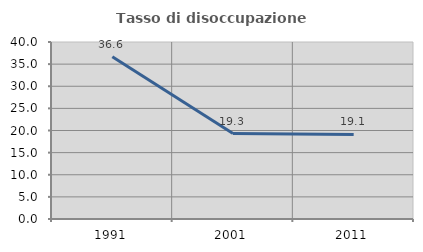
| Category | Tasso di disoccupazione giovanile  |
|---|---|
| 1991.0 | 36.646 |
| 2001.0 | 19.318 |
| 2011.0 | 19.118 |